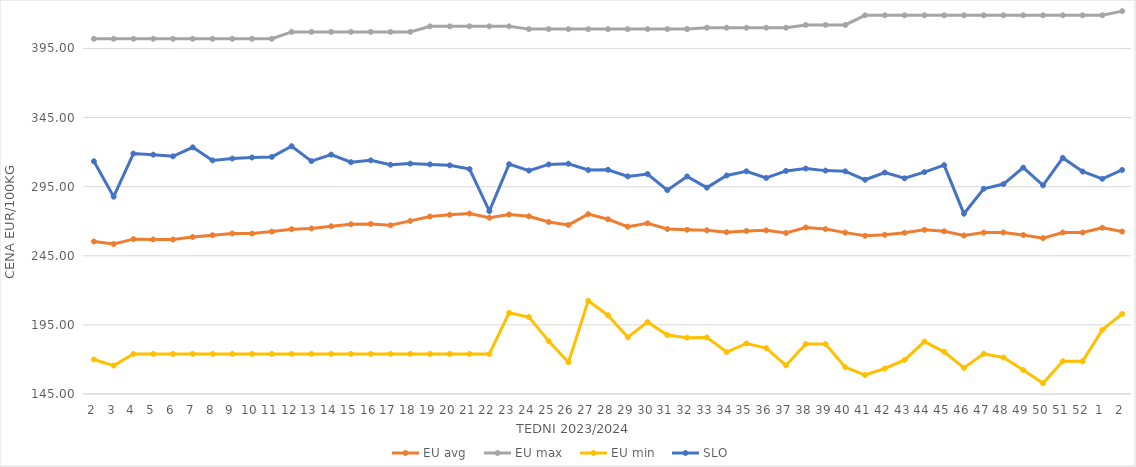
| Category | EU avg | EU max | EU min | SLO |
|---|---|---|---|---|
| 2.0 | 255.331 | 402 | 169.983 | 313.4 |
| 3.0 | 253.546 | 402 | 165.574 | 287.81 |
| 4.0 | 257.051 | 402 | 174 | 318.98 |
| 5.0 | 256.808 | 402 | 174 | 318.13 |
| 6.0 | 256.75 | 402 | 174 | 316.99 |
| 7.0 | 258.565 | 402 | 174 | 323.47 |
| 8.0 | 259.872 | 402 | 174 | 314 |
| 9.0 | 261.164 | 402 | 174 | 315.35 |
| 10.0 | 261.06 | 402 | 174 | 316.13 |
| 11.0 | 262.513 | 402 | 174 | 316.55 |
| 12.0 | 264.228 | 407 | 174 | 324.27 |
| 13.0 | 264.768 | 407 | 174 | 313.49 |
| 14.0 | 266.385 | 407 | 174 | 318.17 |
| 15.0 | 267.797 | 407 | 174 | 312.7 |
| 16.0 | 268.021 | 407 | 174 | 314.07 |
| 17.0 | 267.041 | 407 | 174 | 310.87 |
| 18.0 | 270.255 | 407 | 174 | 311.69 |
| 19.0 | 273.406 | 411 | 174 | 311.13 |
| 20.0 | 274.631 | 411 | 174 | 310.42 |
| 21.0 | 275.561 | 411 | 174 | 307.76 |
| 22.0 | 272.542 | 411 | 174 | 277.34 |
| 23.0 | 274.85 | 411 | 203.728 | 311.28 |
| 24.0 | 273.59 | 409 | 200.686 | 306.64 |
| 25.0 | 269.439 | 409 | 183.275 | 311.1 |
| 26.0 | 267.345 | 409 | 167.858 | 311.62 |
| 27.0 | 275.123 | 409 | 212.506 | 307.04 |
| 28.0 | 271.42 | 409 | 201.945 | 307.23 |
| 29.0 | 266.08 | 409 | 186.018 | 302.45 |
| 30.0 | 268.49 | 409 | 197.093 | 304.14 |
| 31.0 | 264.334 | 409 | 187.684 | 292.49 |
| 32.0 | 263.844 | 409 | 185.774 | 302.41 |
| 33.0 | 263.441 | 410 | 185.951 | 294.3 |
| 34.0 | 262.028 | 410 | 175.332 | 303.1 |
| 35.0 | 262.997 | 410 | 181.543 | 306.13 |
| 36.0 | 263.389 | 410 | 178.207 | 301.32 |
| 37.0 | 261.486 | 410 | 165.697 | 306.4 |
| 38.0 | 265.47 | 412 | 181.159 | 308.12 |
| 39.0 | 264.316 | 412 | 181.124 | 306.62 |
| 40.0 | 261.774 | 412 | 164.37 | 306.1 |
| 41.0 | 259.456 | 419 | 158.728 | 300 |
| 42.0 | 260.21 | 419 | 163.464 | 305.24 |
| 43.0 | 261.605 | 419 | 169.66 | 301.07 |
| 44.0 | 263.758 | 419 | 182.925 | 305.52 |
| 45.0 | 262.714 | 419 | 175.524 | 310.58 |
| 46.0 | 259.625 | 419 | 163.882 | 275.46 |
| 47.0 | 261.772 | 419 | 174.136 | 293.51 |
| 48.0 | 261.864 | 419 | 171.4 | 296.9 |
| 49.0 | 260.014 | 419 | 162.336 | 308.8 |
| 50.0 | 257.768 | 419 | 152.762 | 295.97 |
| 51.0 | 261.869 | 419 | 168.739 | 315.82 |
| 52.0 | 261.805 | 419 | 168.659 | 305.97 |
| 1.0 | 265.269 | 419 | 191.406 | 300.71 |
| 2.0 | 262.51 | 422 | 202.955 | 307.09 |